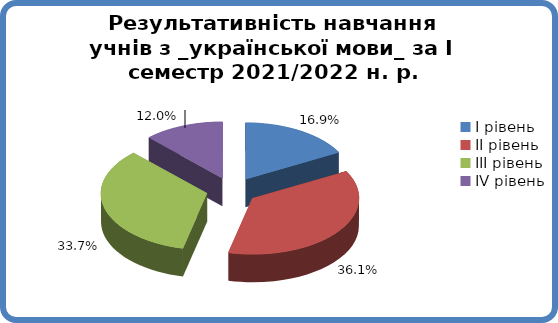
| Category | Series 0 |
|---|---|
| 0 | 0.169 |
| 1 | 0.361 |
| 2 | 0.337 |
| 3 | 0.12 |